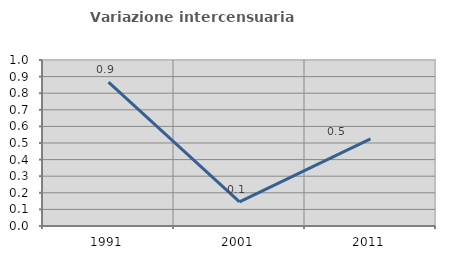
| Category | Variazione intercensuaria annua |
|---|---|
| 1991.0 | 0.867 |
| 2001.0 | 0.146 |
| 2011.0 | 0.525 |